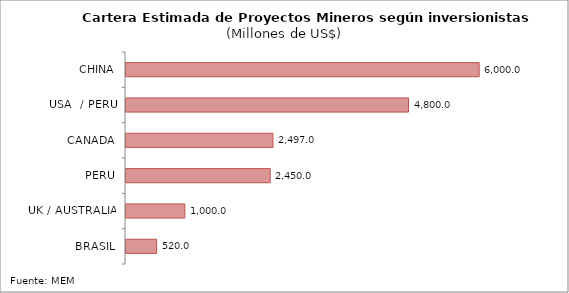
| Category | Series 0 |
|---|---|
| CHINA | 6000 |
| USA  / PERU | 4800 |
| CANADA | 2497 |
| PERU | 2450 |
| UK / AUSTRALIA | 1000 |
| BRASIL | 520 |